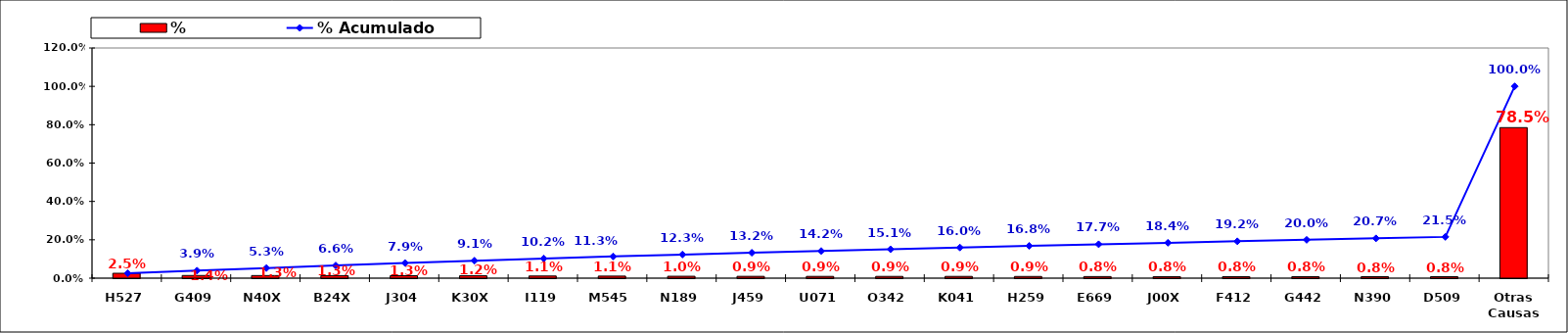
| Category | % |
|---|---|
| H527 | 0.025 |
| G409 | 0.014 |
| N40X | 0.013 |
| B24X | 0.013 |
| J304 | 0.013 |
| K30X | 0.012 |
| I119 | 0.011 |
| M545 | 0.011 |
| N189 | 0.01 |
| J459 | 0.009 |
| U071 | 0.009 |
| O342 | 0.009 |
| K041 | 0.009 |
| H259 | 0.009 |
| E669 | 0.008 |
| J00X | 0.008 |
| F412 | 0.008 |
| G442 | 0.008 |
| N390 | 0.008 |
| D509 | 0.008 |
| Otras Causas | 0.785 |